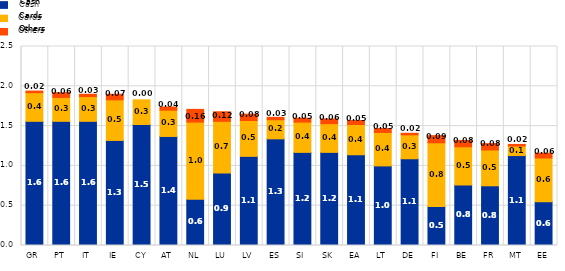
| Category | Cash | Cards | Others |
|---|---|---|---|
| GR | 1.56 | 0.36 | 0.02 |
| PT | 1.56 | 0.3 | 0.06 |
| IT | 1.56 | 0.31 | 0.03 |
| IE | 1.32 | 0.51 | 0.07 |
| CY | 1.52 | 0.31 | 0 |
| AT | 1.37 | 0.33 | 0.04 |
| NL | 0.58 | 0.97 | 0.16 |
| LU | 0.91 | 0.65 | 0.12 |
| LV | 1.12 | 0.45 | 0.08 |
| ES | 1.34 | 0.24 | 0.03 |
| SI | 1.17 | 0.38 | 0.05 |
| SK | 1.17 | 0.36 | 0.06 |
| EA | 1.14 | 0.38 | 0.05 |
| LT | 1 | 0.42 | 0.05 |
| DE | 1.09 | 0.3 | 0.02 |
| FI | 0.49 | 0.8 | 0.09 |
| BE | 0.76 | 0.48 | 0.08 |
| FR | 0.75 | 0.45 | 0.08 |
| MT | 1.13 | 0.12 | 0.02 |
| EE | 0.55 | 0.55 | 0.06 |